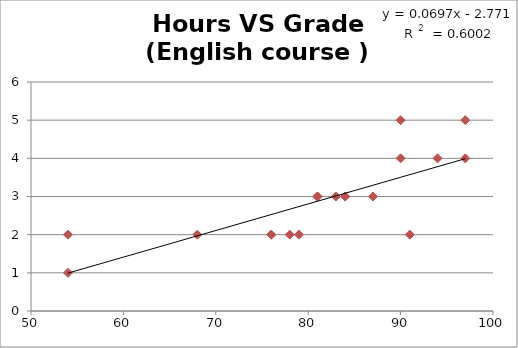
| Category | sorted hours  |
|---|---|
| 54.0 | 1 |
| 54.0 | 2 |
| 76.0 | 2 |
| 78.0 | 2 |
| 79.0 | 2 |
| 68.0 | 2 |
| 76.0 | 2 |
| 91.0 | 2 |
| 84.0 | 3 |
| 81.0 | 3 |
| 81.0 | 3 |
| 83.0 | 3 |
| 84.0 | 3 |
| 83.0 | 3 |
| 87.0 | 3 |
| 90.0 | 4 |
| 97.0 | 4 |
| 94.0 | 4 |
| 90.0 | 5 |
| 97.0 | 5 |